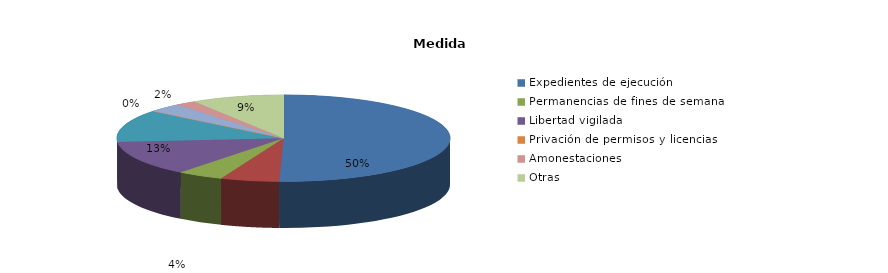
| Category | Series 0 |
|---|---|
| Expedientes de ejecución | 124 |
| Internamientos | 14 |
| Permanencias de fines de semana | 11 |
| Libertad vigilada | 32 |
| Prestaciones en beneficio de la comunidad | 30 |
| Privación de permisos y licencias | 0 |
| Convivencia Familiar Educativa | 8 |
| Amonestaciones | 5 |
| Otras | 22 |